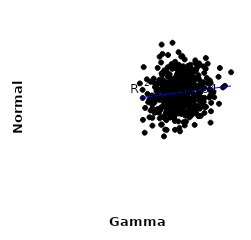
| Category | Series 0 |
|---|---|
| 69.50091099472762 | 774.494 |
| 64.76195551774569 | 627.892 |
| 52.61599306429363 | 749.544 |
| 70.52165849465416 | 779.877 |
| 66.70148227374929 | 832.307 |
| 60.17512605375697 | 646.233 |
| 63.05868329611551 | 577.009 |
| 69.7112657836907 | 740.854 |
| 56.74791062412148 | 639.082 |
| 62.64018640640481 | 674.128 |
| 62.4076777091893 | 740.859 |
| 61.206138520618694 | 726.689 |
| 64.09080310394624 | 778.202 |
| 58.86115325839018 | 654.74 |
| 67.63778254976891 | 609.296 |
| 58.26992391893475 | 718.578 |
| 62.54112199188573 | 648.875 |
| 55.28059198873451 | 707.442 |
| 68.75714102755667 | 788.634 |
| 59.076305241577266 | 744.595 |
| 57.23111447793356 | 674.608 |
| 71.03455433065072 | 734.386 |
| 62.600856330712084 | 631.546 |
| 57.26672347848252 | 643.633 |
| 66.9254650715199 | 857.381 |
| 53.039568420895606 | 727.508 |
| 60.274634588186956 | 704.56 |
| 60.23069764821688 | 628.615 |
| 60.18112853912866 | 657.765 |
| 60.922161307929194 | 697.331 |
| 76.26484020752335 | 663.845 |
| 66.30910836680529 | 753.634 |
| 58.00721651236583 | 579.779 |
| 70.13679444129949 | 891.676 |
| 65.98721710906308 | 614.426 |
| 59.21406231988178 | 541.601 |
| 71.3988687306455 | 856.465 |
| 67.41817342015584 | 552.156 |
| 57.233685607543016 | 654.455 |
| 69.2878588684987 | 687.217 |
| 60.21771374545117 | 999.563 |
| 62.99415790902303 | 573.206 |
| 71.37086996908496 | 718.231 |
| 57.17063782545434 | 692.555 |
| 61.937436230188524 | 665.877 |
| 59.686064288371426 | 613.667 |
| 70.84228764809791 | 862.778 |
| 63.61791543163333 | 738.433 |
| 63.222237600138044 | 750.719 |
| 72.49753793576865 | 551.413 |
| 65.5347842203842 | 834.441 |
| 57.507427400437415 | 663.537 |
| 56.34098943048083 | 749.045 |
| 59.07166223004286 | 733.985 |
| 51.238126960161765 | 676.805 |
| 52.982491198065595 | 734.247 |
| 57.04651442063208 | 825.522 |
| 64.42130714959855 | 683.137 |
| 74.01556735592595 | 814.492 |
| 61.15694388540712 | 729.429 |
| 65.06349279447181 | 669.674 |
| 73.02307123042458 | 735.844 |
| 57.1787627227264 | 667.926 |
| 55.53632941959542 | 499.237 |
| 51.886835896262525 | 665.543 |
| 63.56718378816237 | 830.56 |
| 68.48387335111445 | 812.123 |
| 67.28289763268793 | 691.127 |
| 68.23146030515073 | 709.698 |
| 59.926466114508095 | 612.051 |
| 67.37299463641489 | 741.121 |
| 57.30036290093752 | 562.684 |
| 67.87613182079596 | 714.434 |
| 61.29887036553006 | 466.673 |
| 60.69048338788342 | 700.037 |
| 60.39263111576683 | 669.985 |
| 65.43249872364885 | 631.91 |
| 69.70544868620676 | 643.774 |
| 52.398699250076405 | 633.641 |
| 56.79542558856949 | 644.787 |
| 50.43973375643995 | 654.773 |
| 69.28161279365062 | 832.536 |
| 57.37985278345908 | 700.417 |
| 56.29770311885407 | 667.228 |
| 58.145101834557195 | 849.463 |
| 56.26266241641944 | 657.965 |
| 76.22691691536374 | 747.171 |
| 56.54642187577068 | 619.642 |
| 60.11243662858948 | 677.282 |
| 64.17251918789745 | 818.721 |
| 47.22291988231383 | 711.397 |
| 68.15053554529159 | 740.291 |
| 65.88464447178015 | 653.709 |
| 76.80521917207211 | 754.305 |
| 58.14844185337998 | 729.745 |
| 73.68264152253269 | 757.984 |
| 60.318544101325095 | 703.245 |
| 64.29239414460692 | 658.937 |
| 61.824322095639936 | 649.112 |
| 64.69466938695037 | 644.377 |
| 52.25590752080931 | 669.954 |
| 62.596996113513285 | 749.416 |
| 48.13023951954797 | 448.77 |
| 67.32756793712086 | 755.817 |
| 64.68322972636611 | 781.876 |
| 61.066535389333595 | 772.189 |
| 69.26925099089655 | 817.153 |
| 64.75408511352536 | 653.509 |
| 60.61563006948027 | 691.69 |
| 51.48198382665087 | 491.987 |
| 63.19156058910006 | 800.377 |
| 66.7464429547181 | 636.303 |
| 77.5665643314623 | 689.779 |
| 64.85466874011674 | 855.255 |
| 69.00573820225488 | 791.736 |
| 57.834627900208794 | 819.547 |
| 50.69278305676477 | 584.841 |
| 65.35335944368941 | 686.007 |
| 57.10074744846673 | 655.153 |
| 53.30954703306251 | 673.947 |
| 59.71548597126473 | 737.296 |
| 71.71186175709391 | 550.042 |
| 56.56378051165731 | 734.275 |
| 61.11257528387714 | 556.562 |
| 66.64295212033073 | 789.173 |
| 70.0750253328988 | 675.672 |
| 64.79165841536769 | 762.114 |
| 74.65361604491117 | 839.773 |
| 57.54000730312532 | 525.405 |
| 59.36731094948259 | 612.782 |
| 63.19810926546527 | 477.639 |
| 65.38035793357088 | 711.702 |
| 55.57915526877703 | 667.912 |
| 73.81883661287358 | 637.304 |
| 63.171075117094176 | 583.617 |
| 71.71994652506196 | 607.273 |
| 60.57506898712451 | 691.306 |
| 64.07307080958964 | 751.661 |
| 66.68897949598718 | 747.216 |
| 66.99219950685575 | 696.586 |
| 66.52322645834933 | 677.868 |
| 61.3458828964705 | 882.705 |
| 63.483502743120624 | 623.583 |
| 68.68895333289115 | 603.983 |
| 64.42971439208331 | 661.585 |
| 59.51045112429658 | 736.321 |
| 66.10860885129902 | 817.4 |
| 60.339108582198946 | 773.498 |
| 53.46291826533245 | 656.526 |
| 55.291752881513574 | 497.551 |
| 59.310683093816124 | 733.077 |
| 54.879046962569525 | 586.655 |
| 51.055161022090296 | 667.16 |
| 64.42153882276874 | 675.271 |
| 58.974147119165444 | 567.929 |
| 62.409749872626065 | 810.687 |
| 68.94434250960785 | 653.032 |
| 47.69929736604951 | 850.383 |
| 67.66081145249171 | 731.298 |
| 70.35537521320411 | 782.763 |
| 49.33606562056135 | 686.715 |
| 67.8043589536183 | 776.412 |
| 61.93180367981155 | 586.604 |
| 67.3744874985111 | 644.011 |
| 58.71278528438598 | 760.35 |
| 50.21024760970649 | 543.132 |
| 59.55608696479775 | 587.637 |
| 78.0280393691595 | 696.71 |
| 53.772894030487436 | 574.746 |
| 83.01413366650921 | 735.577 |
| 74.25826842421871 | 605.448 |
| 64.92287823440994 | 724.469 |
| 64.36061876196356 | 674.062 |
| 58.2200754979025 | 636.12 |
| 70.49314611785132 | 570.348 |
| 68.90725763353632 | 725.945 |
| 55.68855322700942 | 802.673 |
| 60.32310068102428 | 721.067 |
| 65.39817542192193 | 790.513 |
| 61.37952828066802 | 672.364 |
| 63.487804449626246 | 457.082 |
| 62.855465301864356 | 941.723 |
| 47.37125413446966 | 527.344 |
| 67.91800820489179 | 864.962 |
| 66.1269259559803 | 662.084 |
| 61.073501356054976 | 746.066 |
| 55.98142038139123 | 721.818 |
| 60.83344034718464 | 752.023 |
| 67.6844843176955 | 783.203 |
| 64.71076347182938 | 681.542 |
| 59.39675635394303 | 665.741 |
| 54.29381114518056 | 571.975 |
| 56.47191913705381 | 696.818 |
| 52.211916637997085 | 662.382 |
| 57.55941929427462 | 720.726 |
| 56.85963928138579 | 537.299 |
| 57.874607179050535 | 589.042 |
| 66.0578051837437 | 567.602 |
| 69.39431896253204 | 675.074 |
| 71.923099103706 | 862.497 |
| 65.53448015166826 | 571.774 |
| 57.8216457537965 | 587.584 |
| 66.68749888763676 | 817.516 |
| 59.89619240060623 | 760.985 |
| 53.23553388820803 | 702.401 |
| 54.60443942441889 | 648.697 |
| 60.141376276325275 | 867.416 |
| 52.438767890613256 | 570.827 |
| 65.5125994291472 | 897.256 |
| 62.13985789418232 | 584.898 |
| 49.65802528727438 | 634.957 |
| 65.15596612080031 | 565.057 |
| 62.05580816790858 | 837.575 |
| 59.273385826312605 | 765.606 |
| 63.507591373446694 | 742.831 |
| 74.12870359999056 | 721.386 |
| 52.04536709035201 | 780.012 |
| 65.07274874608865 | 734.544 |
| 59.52648091620508 | 648.618 |
| 59.23643607805128 | 735.517 |
| 51.43146363530009 | 539.553 |
| 61.08119667385985 | 845.991 |
| 63.41324553597217 | 652.393 |
| 62.122692691265414 | 780.476 |
| 65.53730436470207 | 493.667 |
| 71.84013729396757 | 872.79 |
| 64.48070670558747 | 692 |
| 57.05007319789281 | 467.844 |
| 66.07383109449435 | 516.821 |
| 63.30655648202877 | 675.409 |
| 62.155009442719205 | 631.024 |
| 53.68459027764542 | 593.53 |
| 56.97117094294261 | 678.663 |
| 65.97691074258405 | 748.485 |
| 60.58901407252903 | 574.97 |
| 59.61454122694128 | 860.765 |
| 55.20519826113419 | 603.823 |
| 56.64713925623398 | 740.843 |
| 75.59743791041046 | 751.364 |
| 68.6465833165831 | 727.513 |
| 58.87263999113157 | 747.278 |
| 67.88506702991084 | 755.013 |
| 53.759264154746845 | 845.44 |
| 56.67558519155124 | 652.225 |
| 56.62483215994605 | 632.931 |
| 55.98022327486784 | 736.594 |
| 54.66401396281849 | 773.116 |
| 59.27948971986333 | 556.603 |
| 50.724334122068875 | 760.28 |
| 47.287090184288715 | 661.502 |
| 65.529518142136 | 767.455 |
| 61.01749158468499 | 549.651 |
| 55.490481395319925 | 988.175 |
| 57.91803027923841 | 615.738 |
| 73.91085575463653 | 613.869 |
| 62.79436996945401 | 517.534 |
| 55.86466241212812 | 930.803 |
| 67.58838662566744 | 542.414 |
| 71.57203638244023 | 716.353 |
| 65.07321096409527 | 700.357 |
| 77.03208697199908 | 631.881 |
| 72.00435654081942 | 768.099 |
| 58.29275869334839 | 924.513 |
| 61.22061455235402 | 778.839 |
| 54.449756294848456 | 714.059 |
| 61.802719666188786 | 722.913 |
| 62.19058042529273 | 797.989 |
| 65.15919128744089 | 708.578 |
| 64.3969691015535 | 713.062 |
| 67.87763755243732 | 812.34 |
| 64.14317383289558 | 695.603 |
| 59.80384873701511 | 868.714 |
| 54.618492025332316 | 913.936 |
| 67.31463923998903 | 629.062 |
| 70.56244571718632 | 838.375 |
| 58.67636334739559 | 664.585 |
| 64.57761082258777 | 772.339 |
| 71.49287507474098 | 800.776 |
| 66.972890267841 | 575.545 |
| 74.78363156082165 | 606.787 |
| 56.36158227788236 | 691.156 |
| 56.02482750719149 | 666.959 |
| 65.02091202069111 | 679.121 |
| 72.08029553342756 | 730.606 |
| 59.00489605621088 | 805.703 |
| 61.65407149844974 | 602.156 |
| 63.669834252575434 | 689.497 |
| 63.23060411318341 | 850.166 |
| 58.99996302169626 | 788.646 |
| 55.44366106960414 | 749.837 |
| 51.46283434319059 | 618.559 |
| 57.17371754556807 | 729.533 |
| 69.52395748962779 | 750.031 |
| 60.77015038423542 | 677.174 |
| 63.79882992353747 | 598.592 |
| 62.1055766322975 | 732.555 |
| 64.26370922855499 | 641.086 |
| 54.5125522006696 | 661.474 |
| 75.5312738321754 | 871.347 |
| 53.40608892909836 | 654.519 |
| 60.03447556619361 | 839.613 |
| 65.45239796751538 | 803.46 |
| 63.36601488060432 | 728.291 |
| 61.01426585284449 | 618.157 |
| 51.2877084538274 | 591.699 |
| 72.11118451759852 | 595.946 |
| 72.36457838257815 | 697.039 |
| 80.45335170423719 | 625.777 |
| 71.85479088856754 | 669.551 |
| 70.18984276189423 | 594.039 |
| 66.19011085184555 | 640.585 |
| 63.64039266147519 | 648.5 |
| 61.91367613098797 | 851.169 |
| 59.592879886019 | 710.1 |
| 52.593803456076486 | 728.089 |
| 52.959102063385025 | 743.419 |
| 65.23814417547827 | 742.616 |
| 67.81495765058514 | 551.183 |
| 82.15560650474538 | 725.84 |
| 57.312444696931976 | 612.441 |
| 53.76008291558832 | 704.463 |
| 67.20863070563199 | 662.149 |
| 62.69897230049927 | 583.002 |
| 60.426484025158096 | 661.183 |
| 58.459739050970306 | 722.885 |
| 64.52946127771338 | 664.516 |
| 52.73012429091031 | 587.468 |
| 71.44705737317362 | 550.668 |
| 66.63214065974805 | 665.184 |
| 66.51400339946215 | 732.93 |
| 64.49267633526367 | 917.451 |
| 76.95763163677503 | 579.844 |
| 46.02968649344053 | 750.519 |
| 62.132561745082356 | 673.134 |
| 59.258249839059886 | 544.928 |
| 59.49458722234259 | 683.617 |
| 60.991833455058895 | 533.754 |
| 78.36211645022209 | 665.896 |
| 75.14875420326642 | 783.719 |
| 61.41079332201177 | 594.925 |
| 59.452791588025626 | 619.169 |
| 59.18079446445457 | 719.866 |
| 57.20433580393498 | 631.341 |
| 71.09653962908571 | 613.549 |
| 49.07219451597056 | 775.591 |
| 69.29748524236133 | 569.899 |
| 76.65843586692827 | 677.051 |
| 59.93205317399498 | 558.564 |
| 63.97859315573747 | 563.24 |
| 55.80987522695267 | 707.722 |
| 60.064764037951356 | 665.396 |
| 60.95505519722186 | 692.565 |
| 60.92714296523135 | 771.771 |
| 58.029114360835244 | 623.327 |
| 72.96573040574525 | 663.21 |
| 67.91217432911925 | 632.449 |
| 57.70812104057701 | 591.912 |
| 61.87221026680151 | 649.038 |
| 61.79516858283596 | 732.309 |
| 59.47167259797546 | 708.554 |
| 63.497525703084435 | 772.433 |
| 69.99684112198649 | 776.419 |
| 61.23443441397606 | 520.594 |
| 55.95356822710642 | 610.292 |
| 66.93456418414513 | 643.75 |
| 69.08899476625382 | 602.192 |
| 57.376189426238604 | 573.751 |
| 63.05492777369826 | 660.94 |
| 56.26208317543733 | 705.351 |
| 65.9550923359681 | 651.338 |
| 63.527523386960034 | 818.416 |
| 74.71799987070013 | 906.047 |
| 66.05019090726574 | 576.719 |
| 60.486572487577625 | 655.163 |
| 76.4432834009237 | 714.266 |
| 59.450726487054204 | 746.308 |
| 62.35742836115452 | 727.886 |
| 67.85955877363088 | 702.676 |
| 69.82598069202335 | 615.983 |
| 57.88898966865394 | 680.2 |
| 68.60248116194168 | 839.719 |
| 62.91394537279946 | 773.679 |
| 62.688227647111404 | 718.041 |
| 68.74339940701041 | 562.331 |
| 58.0661581310663 | 794.064 |
| 62.255016577153 | 806.154 |
| 73.55593328188547 | 720.993 |
| 56.64064504513433 | 830.224 |
| 68.31909742318354 | 842.209 |
| 80.82457663786069 | 844.773 |
| 71.21497184065647 | 690.453 |
| 59.280022987946516 | 781.618 |
| 61.90758626637676 | 740.002 |
| 68.1748800259522 | 823.323 |
| 65.8659486638701 | 646.768 |
| 68.7364803793088 | 653.817 |
| 67.23101233940478 | 717.624 |
| 51.40198763234918 | 635.865 |
| 55.46818937103895 | 811.713 |
| 67.52440277596502 | 596.286 |
| 68.24776017704944 | 747.702 |
| 76.44409131102674 | 768.339 |
| 60.81761300053947 | 640.838 |
| 76.78588305180881 | 705.535 |
| 62.91610338812996 | 709.829 |
| 67.82044456833873 | 723.819 |
| 69.84839865967925 | 496.585 |
| 66.12254167688153 | 682.084 |
| 64.4296713399893 | 678.617 |
| 61.78856516435201 | 792.385 |
| 56.53157624980019 | 748.339 |
| 64.39080790648889 | 619.136 |
| 55.784659781700746 | 547.179 |
| 59.74818464712728 | 748.99 |
| 65.64574438172546 | 692.09 |
| 73.0793287036355 | 637 |
| 65.12974124445176 | 687.709 |
| 69.9026019479249 | 724.995 |
| 73.09524485809538 | 731.806 |
| 61.47783843951495 | 851.081 |
| 70.36122049940339 | 675.662 |
| 50.135341462217035 | 650.772 |
| 63.04028339270065 | 713.472 |
| 65.9149748279102 | 663.265 |
| 55.97530662971016 | 815.863 |
| 57.67182911609089 | 465.59 |
| 53.99520892023165 | 751.727 |
| 65.81650507844749 | 552.696 |
| 67.36762892566699 | 847.965 |
| 68.32652451210707 | 596.975 |
| 62.96610390562193 | 864.616 |
| 58.79291081116159 | 589.289 |
| 74.08862965602705 | 569.434 |
| 60.51529123029551 | 698.469 |
| 74.1841423402836 | 662.487 |
| 64.0622127606432 | 711.213 |
| 65.07632053418023 | 513.431 |
| 62.06624059862721 | 679.798 |
| 61.24490912643253 | 625.459 |
| 62.20154438688962 | 596.245 |
| 70.43146222438259 | 828.762 |
| 62.6548449889157 | 566.411 |
| 71.83754522682045 | 646.103 |
| 61.7865240632464 | 627.256 |
| 55.15616675104928 | 595.264 |
| 69.39047430967429 | 579.893 |
| 68.85622441808238 | 734.505 |
| 67.20257236406256 | 559.954 |
| 59.67459596566001 | 635.887 |
| 54.216199747692215 | 676.062 |
| 55.77718289763869 | 655.631 |
| 63.32482523318891 | 723.488 |
| 48.31979355824731 | 600.447 |
| 64.8016821378515 | 590.96 |
| 80.22191757429557 | 791.168 |
| 56.92444346146973 | 661.677 |
| 71.78537712045846 | 663.165 |
| 61.46832035833299 | 746.317 |
| 60.91330355967878 | 646.839 |
| 66.95384530319573 | 632.759 |
| 64.03239013780086 | 914.545 |
| 55.91647852729654 | 772.681 |
| 59.599740334737476 | 691.481 |
| 59.8875011384235 | 727.042 |
| 63.615120727006754 | 676.181 |
| 55.279306840827736 | 878.477 |
| 85.68823580620419 | 818.919 |
| 65.27202004797174 | 702.795 |
| 65.8675347041615 | 727.18 |
| 58.98802831356739 | 684.813 |
| 58.12952727141845 | 680.591 |
| 72.6946311017964 | 637.253 |
| 62.433179273089365 | 847.726 |
| 73.67252734112051 | 854.633 |
| 65.07777861505569 | 641.726 |
| 66.48702977084369 | 807.459 |
| 57.698034889495034 | 601.382 |
| 64.20643197387257 | 763.098 |
| 61.545054528233365 | 610.153 |
| 67.71803973408679 | 757.067 |
| 54.40832924949481 | 770.009 |
| 56.86113512113813 | 762.783 |
| 56.289791965505295 | 761.235 |
| 56.361258328585514 | 764.826 |
| 65.3552767337479 | 757.994 |
| 62.43944167238692 | 622.526 |
| 71.81684362731119 | 735.871 |
| 66.38934516329213 | 765.859 |
| 65.09263894055066 | 624.595 |
| 56.50293098877033 | 426.489 |
| 68.61008815566116 | 557.275 |
| 60.651815333565445 | 598.463 |
| 71.61767171691346 | 779.385 |
| 58.68011683337206 | 722.392 |
| 54.67754556165217 | 537.163 |
| 76.77640777331509 | 510.374 |
| 66.54251402257574 | 662.621 |
| 69.87049798301514 | 585.877 |
| 70.07855877483141 | 874.468 |
| 57.23412831354103 | 672.879 |